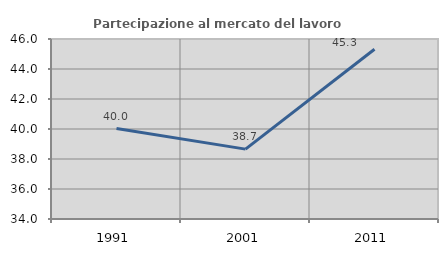
| Category | Partecipazione al mercato del lavoro  femminile |
|---|---|
| 1991.0 | 40.029 |
| 2001.0 | 38.658 |
| 2011.0 | 45.316 |